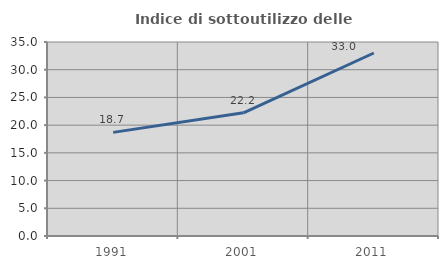
| Category | Indice di sottoutilizzo delle abitazioni  |
|---|---|
| 1991.0 | 18.694 |
| 2001.0 | 22.222 |
| 2011.0 | 33.014 |